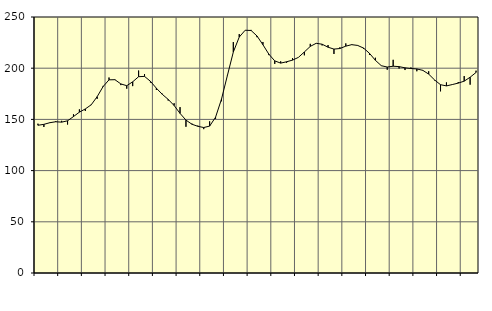
| Category | Piggar | Series 1 |
|---|---|---|
| nan | 145.8 | 144.28 |
| 1.0 | 142.6 | 145.16 |
| 1.0 | 147 | 146.76 |
| 1.0 | 148.4 | 147.7 |
| nan | 148.6 | 147.31 |
| 2.0 | 145 | 148.63 |
| 2.0 | 155 | 152.76 |
| 2.0 | 159.8 | 157.08 |
| nan | 158.2 | 160.23 |
| 3.0 | 164 | 164.3 |
| 3.0 | 170.1 | 172.21 |
| 3.0 | 182.7 | 182.03 |
| nan | 190.9 | 188.63 |
| 4.0 | 188.5 | 188.77 |
| 4.0 | 183.5 | 184.65 |
| 4.0 | 180 | 182.91 |
| nan | 182.5 | 186.7 |
| 5.0 | 197.7 | 191.7 |
| 5.0 | 194.3 | 192.01 |
| 5.0 | 186 | 187.19 |
| nan | 178.8 | 180.48 |
| 6.0 | 175.1 | 174.49 |
| 6.0 | 168.4 | 169.53 |
| 6.0 | 165.8 | 163.57 |
| nan | 162 | 155.88 |
| 7.0 | 142.8 | 149.31 |
| 7.0 | 145.9 | 145.3 |
| 7.0 | 143.9 | 143.25 |
| nan | 140.5 | 142.07 |
| 8.0 | 148.1 | 143.46 |
| 8.0 | 150.5 | 152.13 |
| 8.0 | 167.7 | 169.71 |
| nan | 193.3 | 192.89 |
| 9.0 | 225.5 | 215.78 |
| 9.0 | 233.3 | 230.41 |
| 9.0 | 237.1 | 237.07 |
| nan | 237.4 | 236.84 |
| 10.0 | 230.3 | 231.47 |
| 10.0 | 225.6 | 222.92 |
| 10.0 | 212.8 | 213.74 |
| nan | 204.2 | 207.13 |
| 11.0 | 206.7 | 204.96 |
| 11.0 | 205.3 | 206.28 |
| 11.0 | 209.8 | 207.9 |
| nan | 210.6 | 210.58 |
| 12.0 | 212.6 | 215.86 |
| 12.0 | 223.8 | 221.29 |
| 12.0 | 224.4 | 224.31 |
| nan | 222.2 | 223.43 |
| 13.0 | 222.6 | 220.5 |
| 13.0 | 213.9 | 218.65 |
| 13.0 | 220.4 | 219.21 |
| nan | 224.2 | 221.53 |
| 14.0 | 223.3 | 222.99 |
| 14.0 | 222 | 222.24 |
| 14.0 | 218.9 | 219.66 |
| nan | 213 | 214.53 |
| 15.0 | 210.2 | 207.7 |
| 15.0 | 202.6 | 202.43 |
| 15.0 | 198.5 | 201.14 |
| nan | 208.2 | 201.93 |
| 16.0 | 199.7 | 201.53 |
| 16.0 | 198.2 | 200.35 |
| 16.0 | 200.7 | 199.69 |
| nan | 197 | 199.26 |
| 17.0 | 197.6 | 197.93 |
| 17.0 | 197 | 194.24 |
| 17.0 | 188.1 | 188.52 |
| nan | 177.4 | 183.87 |
| 18.0 | 186.1 | 182.71 |
| 18.0 | 183.9 | 184.05 |
| 18.0 | 186.5 | 185.43 |
| nan | 192.3 | 187.35 |
| 19.0 | 183.9 | 191.18 |
| 19.0 | 197.6 | 195.84 |